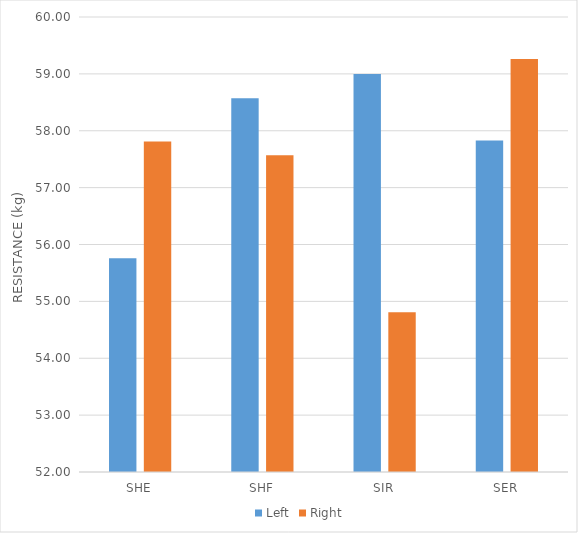
| Category | Left | Right |
|---|---|---|
| SHE | 55.76 | 57.81 |
| SHF | 58.57 | 57.57 |
| SIR | 59 | 54.81 |
| SER | 57.83 | 59.26 |